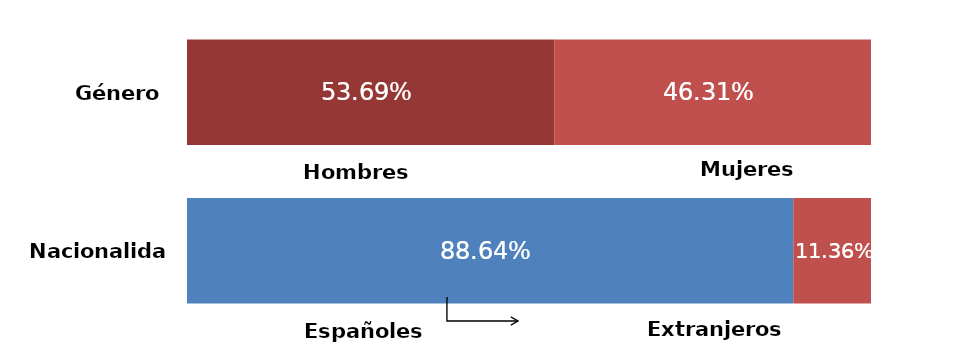
| Category | Series 0 | Series 1 |
|---|---|---|
| 0 | 0.537 | 0.463 |
| 1 | 0.886 | 0.114 |